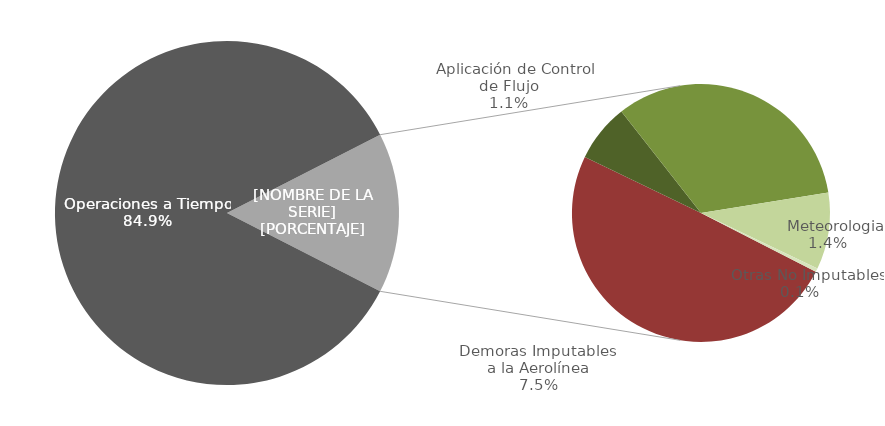
| Category | Demoras |
|---|---|
| Operaciones a Tiempo | 3810 |
| Demoras Imputables 
a la Aerolínea | 335 |
|    Aplicación de Control 
de Flujo | 49 |
|    Repercusiones por un 
Tercero | 223 |
|    Meteorologia | 65 |
|    Otras No Imputables | 3 |